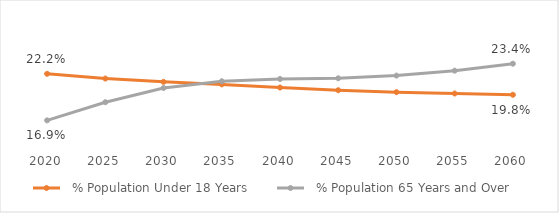
| Category |   % Population Under 18 Years |   % Population 65 Years and Over |
|---|---|---|
| 2020.0 | 0.222 | 0.169 |
| 2025.0 | 0.217 | 0.189 |
| 2030.0 | 0.213 | 0.206 |
| 2035.0 | 0.21 | 0.214 |
| 2040.0 | 0.206 | 0.216 |
| 2045.0 | 0.203 | 0.217 |
| 2050.0 | 0.201 | 0.22 |
| 2055.0 | 0.2 | 0.226 |
| 2060.0 | 0.198 | 0.234 |